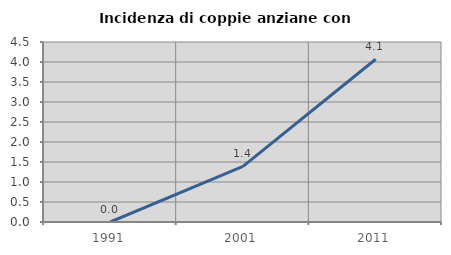
| Category | Incidenza di coppie anziane con figli |
|---|---|
| 1991.0 | 0 |
| 2001.0 | 1.389 |
| 2011.0 | 4.07 |